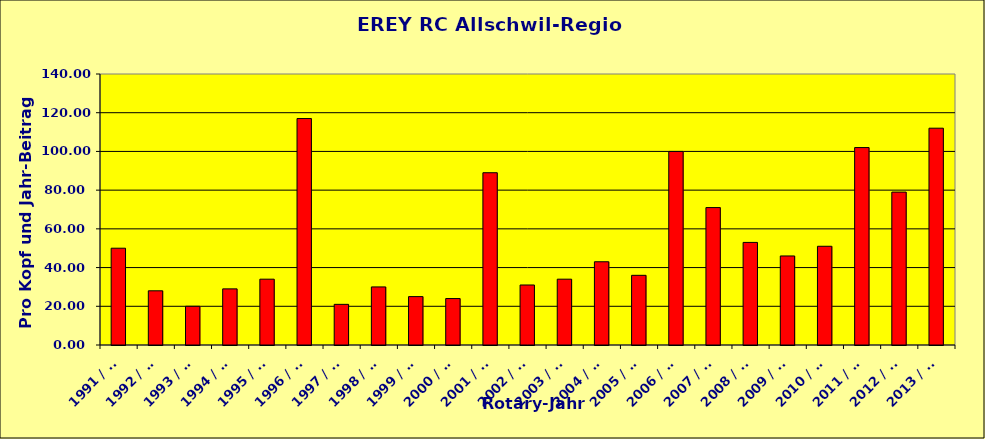
| Category | Series 0 |
|---|---|
| 1991 / 92 | 50 |
| 1992 / 93 | 28 |
| 1993 / 94 | 20 |
| 1994 / 95 | 29 |
| 1995 / 96 | 34 |
| 1996 / 97 | 117 |
| 1997 / 98 | 21 |
| 1998 / 99 | 30 |
| 1999 / 00 | 25 |
| 2000 / 01 | 24 |
| 2001 / 02 | 89 |
| 2002 / 03 | 31 |
| 2003 / 04 | 34 |
| 2004 / 05 | 43 |
| 2005 / 06 | 36 |
| 2006 / 07 | 100 |
| 2007 / 08 | 71 |
| 2008 / 09 | 53 |
| 2009 / 10 | 46 |
| 2010 / 11 | 51 |
| 2011 / 12 | 102 |
| 2012 / 13 | 79 |
| 2013 / 14 | 112 |